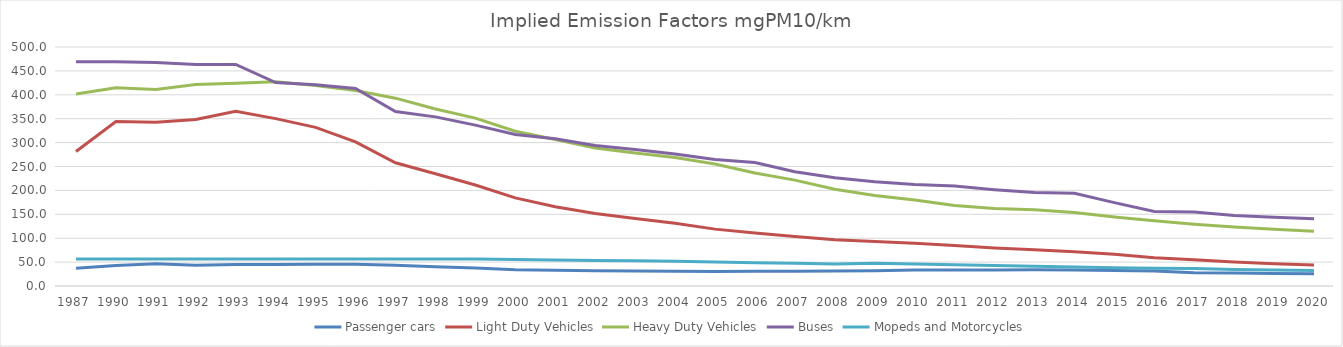
| Category | Passenger cars | Light Duty Vehicles | Heavy Duty Vehicles | Buses | Mopeds and Motorcycles |
|---|---|---|---|---|---|
| 1987.0 | 37.04 | 281.402 | 401.563 | 468.962 | 56.73 |
| 1990.0 | 42.9 | 344.011 | 414.584 | 469.403 | 56.731 |
| 1991.0 | 46.41 | 342.767 | 411.294 | 467.774 | 56.736 |
| 1992.0 | 43.529 | 348.306 | 421.569 | 463.554 | 56.727 |
| 1993.0 | 44.806 | 365.522 | 423.955 | 463.506 | 56.726 |
| 1994.0 | 45.21 | 350.213 | 427.176 | 425.639 | 56.731 |
| 1995.0 | 45.393 | 331.873 | 419.623 | 421.082 | 56.733 |
| 1996.0 | 45.407 | 301.443 | 408.848 | 413.149 | 56.731 |
| 1997.0 | 43.485 | 257.823 | 392.963 | 365.077 | 56.729 |
| 1998.0 | 40.426 | 234.808 | 370.224 | 353.848 | 56.729 |
| 1999.0 | 37.804 | 211.288 | 351.298 | 336.581 | 56.729 |
| 2000.0 | 34.168 | 184.278 | 323.849 | 316.999 | 55.231 |
| 2001.0 | 33.019 | 165.719 | 306.406 | 308.089 | 54.193 |
| 2002.0 | 32.087 | 151.781 | 288.55 | 294.139 | 53.442 |
| 2003.0 | 31.572 | 141.072 | 278.236 | 285.577 | 52.996 |
| 2004.0 | 31.091 | 131.259 | 268.875 | 276.168 | 51.727 |
| 2005.0 | 30.381 | 118.977 | 255.065 | 264.798 | 50.136 |
| 2006.0 | 30.699 | 110.743 | 236.506 | 258.251 | 48.573 |
| 2007.0 | 31.08 | 103.512 | 221.456 | 239.132 | 47.406 |
| 2008.0 | 31.124 | 96.596 | 202.243 | 226.526 | 46.048 |
| 2009.0 | 32.062 | 93.103 | 189.252 | 217.857 | 47.755 |
| 2010.0 | 33.275 | 89.298 | 179.998 | 212.315 | 45.996 |
| 2011.0 | 33.426 | 84.703 | 168.247 | 208.999 | 44.285 |
| 2012.0 | 33.645 | 79.614 | 162.049 | 201.507 | 43.058 |
| 2013.0 | 33.884 | 76.035 | 159.656 | 195.455 | 41.085 |
| 2014.0 | 33.516 | 71.546 | 153.605 | 193.85 | 39.763 |
| 2015.0 | 32.569 | 66.602 | 144.465 | 174.445 | 38.347 |
| 2016.0 | 31.174 | 59.298 | 136.321 | 155.7 | 37.118 |
| 2017.0 | 27.82 | 54.836 | 129.369 | 154.893 | 36.507 |
| 2018.0 | 26.995 | 50.061 | 123.451 | 147.592 | 34.597 |
| 2019.0 | 26.119 | 46.628 | 118.96 | 143.613 | 33.64 |
| 2020.0 | 25.595 | 44.094 | 114.797 | 140.677 | 32.636 |